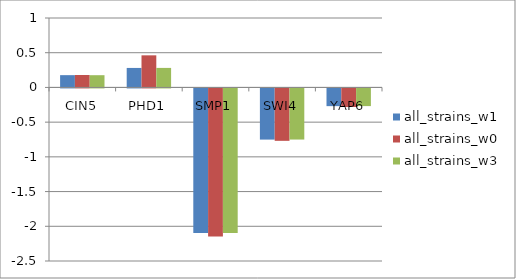
| Category | all_strains_w1 | all_strains_w0 | all_strains_w3 |
|---|---|---|---|
| CIN5 | 0.177 | 0.179 | 0.176 |
| PHD1 | 0.281 | 0.462 | 0.281 |
| SMP1 | -2.082 | -2.131 | -2.083 |
| SWI4 | -0.737 | -0.755 | -0.736 |
| YAP6 | -0.255 | -0.268 | -0.254 |